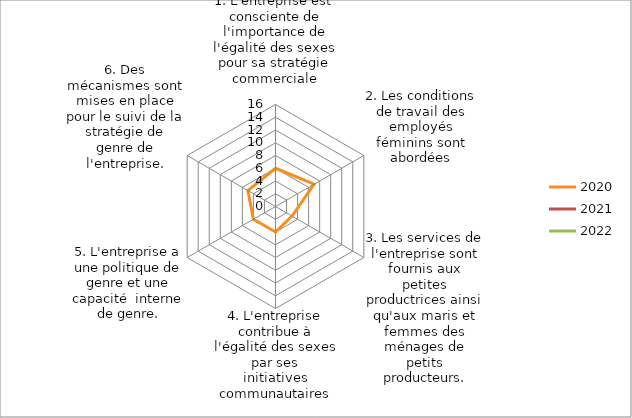
| Category | 2020 | 2021 | 2022 | 2023 |
|---|---|---|---|---|
| 1. L'entreprise est consciente de l'importance de l'égalité des sexes pour sa stratégie commerciale
 | 6 | 0 | 0 | 15 |
| 2. Les conditions de travail des employés féminins sont abordées | 7 | 0 | 0 | 0 |
| 3. Les services de l'entreprise sont fournis aux petites productrices ainsi qu'aux maris et femmes des ménages de petits producteurs.
 | 3 | 0 | 0 | 0 |
| 4. L'entreprise contribue à l'égalité des sexes par ses
initiatives communautaires
 | 4 | 0 | 0 | 0 |
| 5. L'entreprise a une politique de genre et une capacité  interne de genre. | 4 | 0 | 0 | 0 |
| 6. Des mécanismes sont mises en place pour le suivi de la stratégie de genre de l'entreprise.
 | 5 | 0 | 0 | 0 |